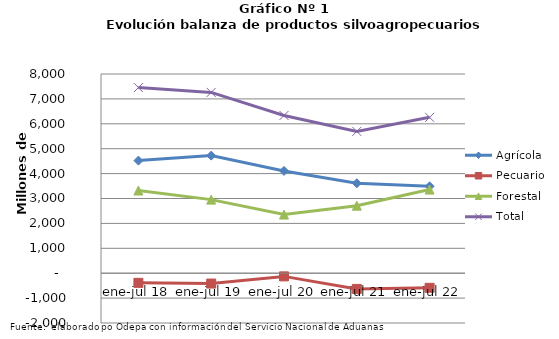
| Category | Agrícola | Pecuario | Forestal | Total |
|---|---|---|---|---|
| ene-jul 18 | 4521970 | -387406 | 3320566 | 7455130 |
| ene-jul 19 | 4722130 | -415826 | 2955438 | 7261742 |
| ene-jul 20 | 4106939 | -128041 | 2355393 | 6334291 |
| ene-jul 21 | 3613288 | -631354 | 2712007 | 5693941 |
| ene-jul 22 | 3488599 | -587274 | 3358013 | 6259338 |